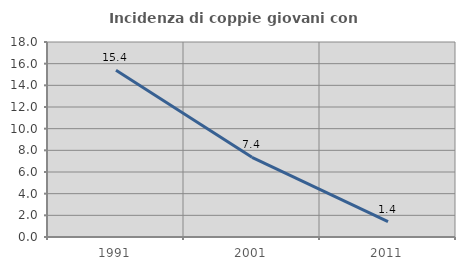
| Category | Incidenza di coppie giovani con figli |
|---|---|
| 1991.0 | 15.385 |
| 2001.0 | 7.353 |
| 2011.0 | 1.429 |